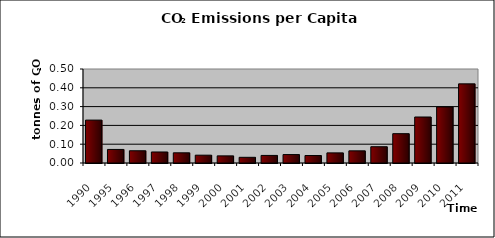
| Category | Series 0 |
|---|---|
| 1990.0 | 0.228 |
| 1995.0 | 0.072 |
| 1996.0 | 0.065 |
| 1997.0 | 0.059 |
| 1998.0 | 0.054 |
| 1999.0 | 0.042 |
| 2000.0 | 0.038 |
| 2001.0 | 0.03 |
| 2002.0 | 0.04 |
| 2003.0 | 0.045 |
| 2004.0 | 0.04 |
| 2005.0 | 0.054 |
| 2006.0 | 0.065 |
| 2007.0 | 0.087 |
| 2008.0 | 0.156 |
| 2009.0 | 0.245 |
| 2010.0 | 0.298 |
| 2011.0 | 0.421 |